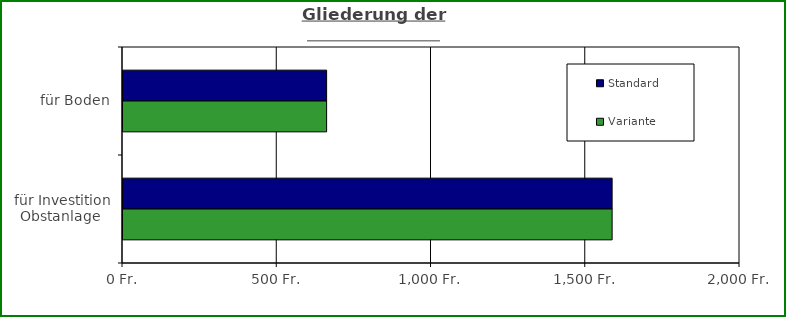
| Category | Standard | Variante  |
|---|---|---|
| für Boden | 660 | 660 |
| für Investition Obstanlage  | 1585.498 | 1585.501 |